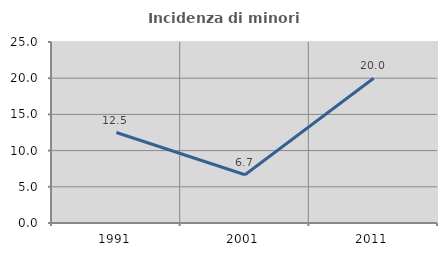
| Category | Incidenza di minori stranieri |
|---|---|
| 1991.0 | 12.5 |
| 2001.0 | 6.667 |
| 2011.0 | 20 |